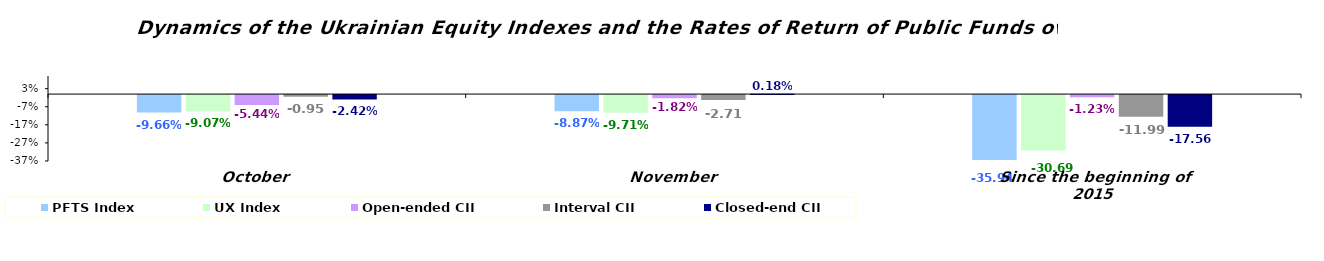
| Category | PFTS Index | UX Index | Open-ended CII | Interval CII | Closed-end CII |
|---|---|---|---|---|---|
| October | -0.097 | -0.091 | -0.054 | -0.01 | -0.024 |
| November | -0.089 | -0.097 | -0.018 | -0.027 | 0.002 |
| Since the beginning of 2015 | -0.359 | -0.307 | -0.012 | -0.12 | -0.176 |